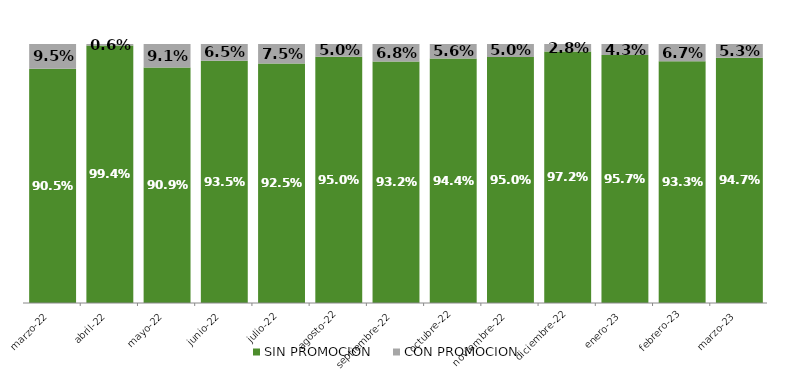
| Category | SIN PROMOCION   | CON PROMOCION   |
|---|---|---|
| 2022-03-01 | 0.905 | 0.095 |
| 2022-04-01 | 0.994 | 0.006 |
| 2022-05-01 | 0.909 | 0.091 |
| 2022-06-01 | 0.935 | 0.065 |
| 2022-07-01 | 0.925 | 0.075 |
| 2022-08-01 | 0.95 | 0.05 |
| 2022-09-01 | 0.932 | 0.068 |
| 2022-10-01 | 0.944 | 0.056 |
| 2022-11-01 | 0.95 | 0.05 |
| 2022-12-01 | 0.972 | 0.028 |
| 2023-01-01 | 0.957 | 0.043 |
| 2023-02-01 | 0.933 | 0.067 |
| 2023-03-01 | 0.947 | 0.053 |